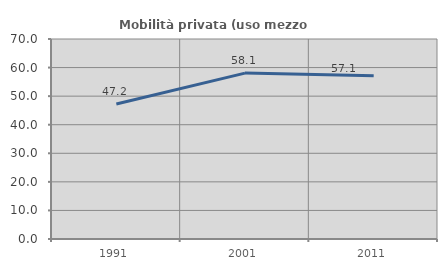
| Category | Mobilità privata (uso mezzo privato) |
|---|---|
| 1991.0 | 47.222 |
| 2001.0 | 58.065 |
| 2011.0 | 57.143 |